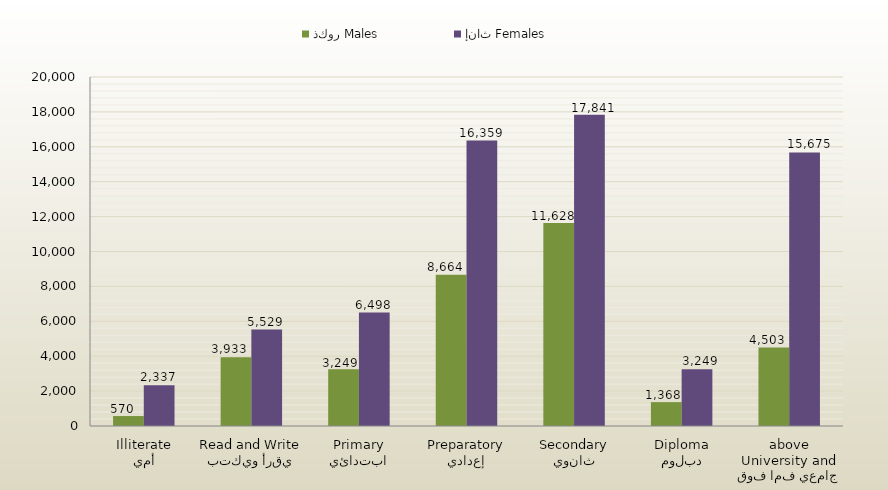
| Category | ذكور Males | إناث Females |
|---|---|---|
| أمي
Illiterate | 570 | 2337 |
| يقرأ ويكتب
Read and Write | 3933 | 5529 |
| ابتدائي
Primary | 3249 | 6498 |
| إعدادي
Preparatory | 8664 | 16359 |
| ثانوي
Secondary | 11628 | 17841 |
| دبلوم
Diploma | 1368 | 3249 |
| جامعي فما فوق
University and above | 4503 | 15675 |